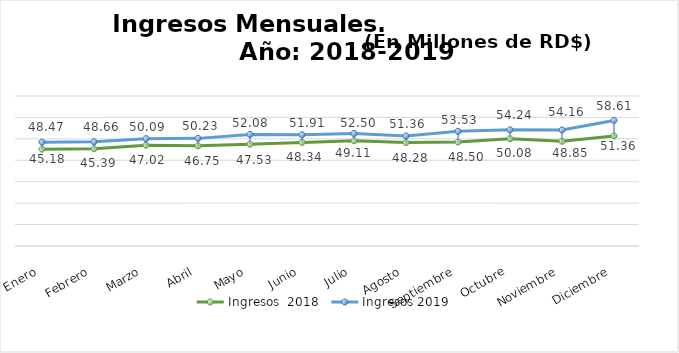
| Category | Ingresos  2018 | Ingresos 2019 |
|---|---|---|
| Enero | 45.176 | 48.474 |
| Febrero | 45.387 | 48.656 |
| Marzo | 47.019 | 50.087 |
| Abril | 46.746 | 50.227 |
| Mayo | 47.526 | 52.084 |
| Junio | 48.343 | 51.91 |
| Julio | 49.111 | 52.497 |
| Agosto | 48.276 | 51.358 |
| Septiembre | 48.498 | 53.53 |
| Octubre | 50.082 | 54.235 |
| Noviembre | 48.85 | 54.156 |
| Diciembre | 51.357 | 58.609 |